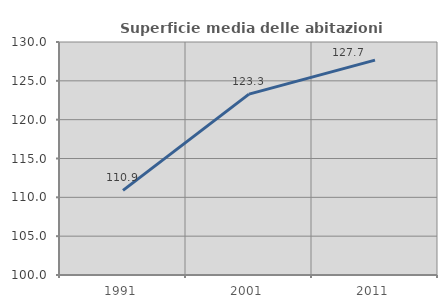
| Category | Superficie media delle abitazioni occupate |
|---|---|
| 1991.0 | 110.901 |
| 2001.0 | 123.291 |
| 2011.0 | 127.67 |